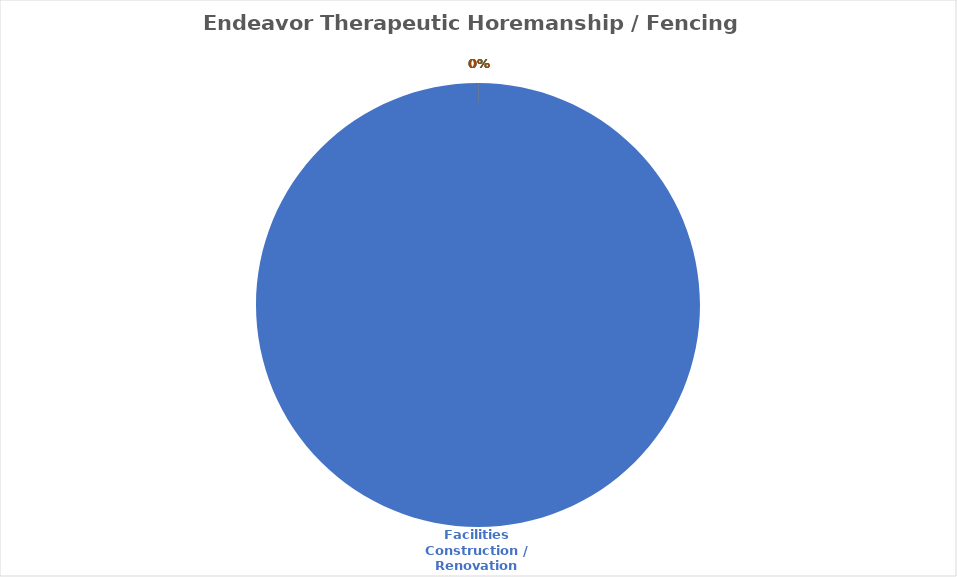
| Category | Series 0 |
|---|---|
| Facilities Construction / Renovation | 80000 |